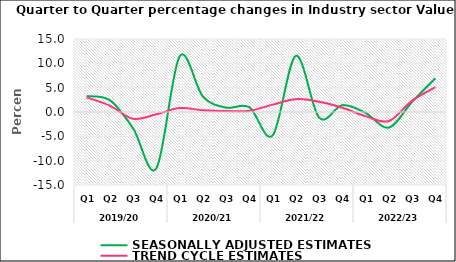
| Category | SEASONALLY ADJUSTED ESTIMATES | TREND CYCLE ESTIMATES |
|---|---|---|
| 0 | 3.255 | 3.004 |
| 1 | 2.418 | 1.313 |
| 2 | -3.367 | -1.392 |
| 3 | -11.584 | -0.463 |
| 4 | 11.427 | 0.811 |
| 5 | 3.187 | 0.364 |
| 6 | 0.899 | 0.209 |
| 7 | 0.976 | 0.256 |
| 8 | -4.815 | 1.517 |
| 9 | 11.537 | 2.633 |
| 10 | -1.163 | 2.112 |
| 11 | 1.407 | 0.868 |
| 12 | -0.196 | -0.849 |
| 13 | -3.196 | -1.862 |
| 14 | 2.094 | 2.335 |
| 15 | 6.939 | 5.112 |